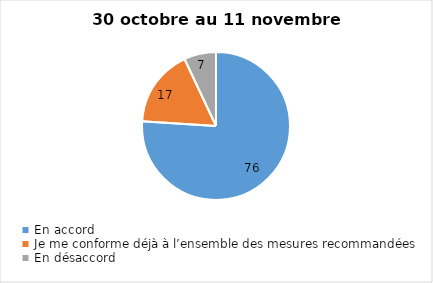
| Category | Series 0 |
|---|---|
| En accord | 76 |
| Je me conforme déjà à l’ensemble des mesures recommandées | 17 |
| En désaccord | 7 |